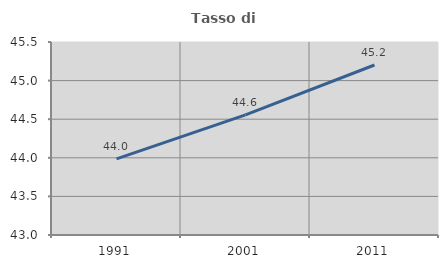
| Category | Tasso di occupazione   |
|---|---|
| 1991.0 | 43.987 |
| 2001.0 | 44.556 |
| 2011.0 | 45.202 |